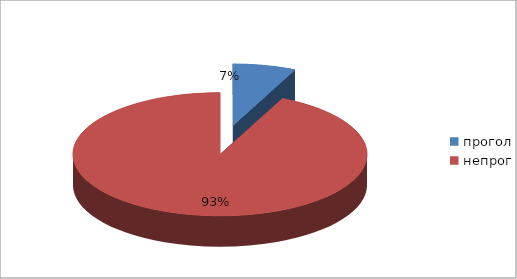
| Category | Series 0 |
|---|---|
| прогол | 5 |
| непрог | 67 |